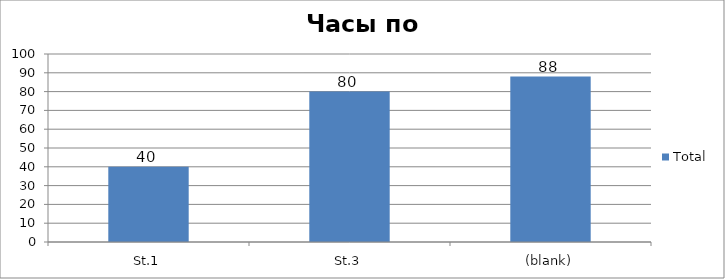
| Category | Total |
|---|---|
| St.1 | 40 |
| St.3 | 80 |
| (blank) | 88 |